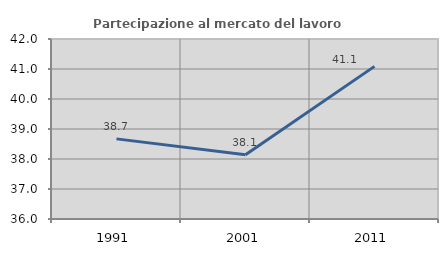
| Category | Partecipazione al mercato del lavoro  femminile |
|---|---|
| 1991.0 | 38.671 |
| 2001.0 | 38.138 |
| 2011.0 | 41.088 |